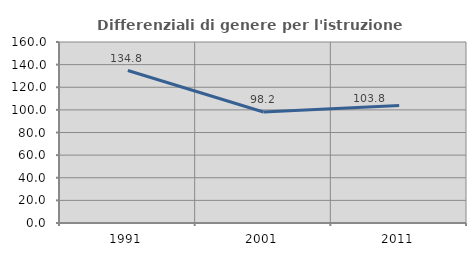
| Category | Differenziali di genere per l'istruzione superiore |
|---|---|
| 1991.0 | 134.788 |
| 2001.0 | 98.164 |
| 2011.0 | 103.829 |